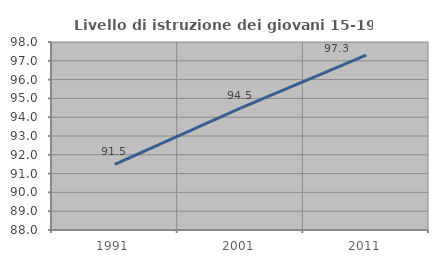
| Category | Livello di istruzione dei giovani 15-19 anni |
|---|---|
| 1991.0 | 91.489 |
| 2001.0 | 94.479 |
| 2011.0 | 97.297 |